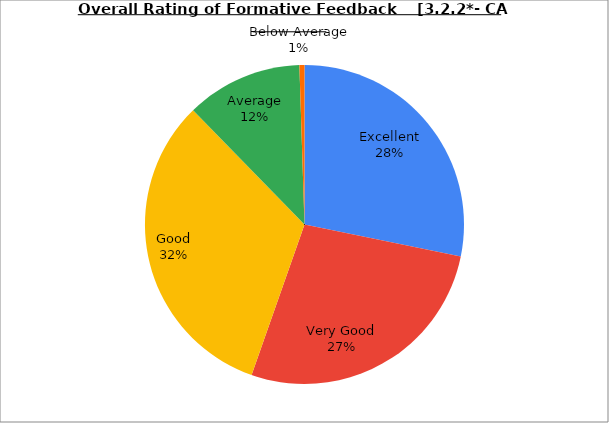
| Category | Series 0 |
|---|---|
| Excellent | 28.205 |
| Very Good | 27.179 |
| Good | 32.308 |
| Average | 11.795 |
| Below Average | 0.513 |